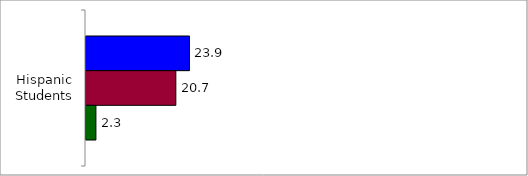
| Category | 50 States and D.C. | SREB States | State |
|---|---|---|---|
| 0 | 23.897 | 20.749 | 2.289 |